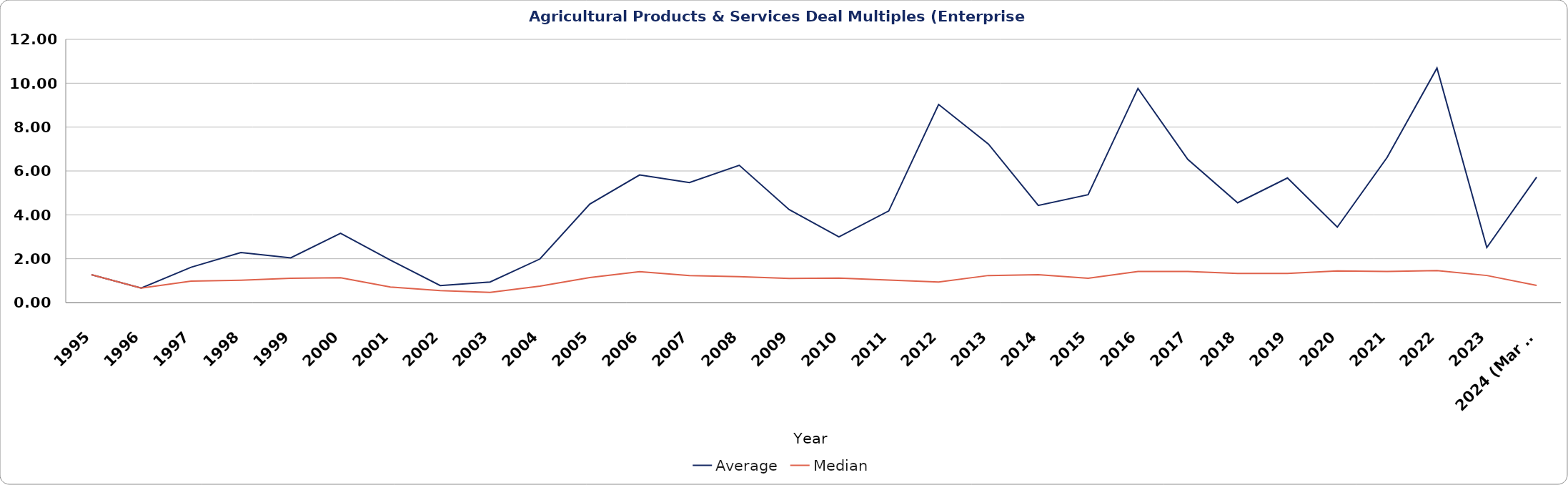
| Category | Average | Median |
|---|---|---|
| 1995 | 1.27 | 1.27 |
| 1996 | 0.66 | 0.66 |
| 1997 | 1.61 | 0.98 |
| 1998 | 2.28 | 1.02 |
| 1999 | 2.04 | 1.11 |
| 2000 | 3.163 | 1.13 |
| 2001 | 1.939 | 0.711 |
| 2002 | 0.776 | 0.544 |
| 2003 | 0.94 | 0.467 |
| 2004 | 1.988 | 0.75 |
| 2005 | 4.49 | 1.14 |
| 2006 | 5.82 | 1.41 |
| 2007 | 5.473 | 1.23 |
| 2008 | 6.26 | 1.18 |
| 2009 | 4.24 | 1.1 |
| 2010 | 2.997 | 1.12 |
| 2011 | 4.18 | 1.03 |
| 2012 | 9.03 | 0.94 |
| 2013 | 7.225 | 1.235 |
| 2014 | 4.429 | 1.27 |
| 2015 | 4.919 | 1.11 |
| 2016 | 9.762 | 1.415 |
| 2017 | 6.528 | 1.42 |
| 2018 | 4.55 | 1.33 |
| 2019 | 5.68 | 1.33 |
| 2020 | 3.438 | 1.44 |
| 2021 | 6.62 | 1.42 |
| 2022 | 10.691 | 1.46 |
| 2023 | 2.51 | 1.235 |
| 2024 (Mar 31) | 5.72 | 0.78 |